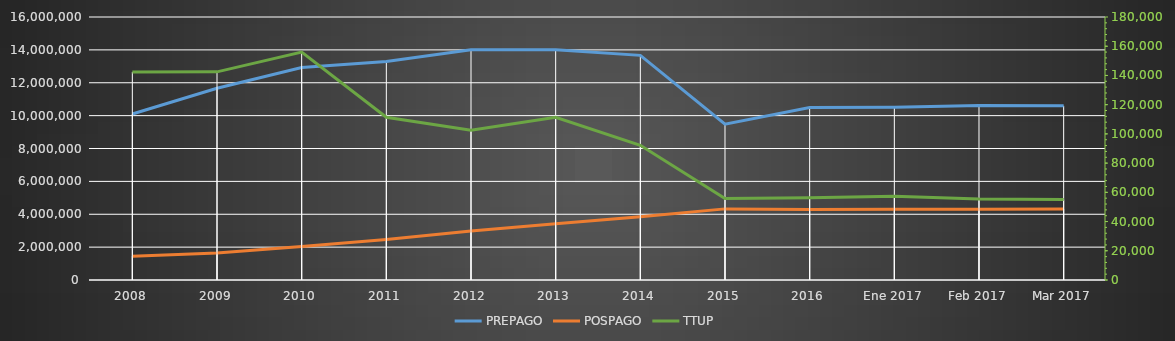
| Category | PREPAGO | POSPAGO |
|---|---|---|
| 2008 | 10097768 | 1452088 |
| 2009 | 11662294 | 1649838 |
| 2010 | 12929040 | 2033814 |
| 2011 | 13295834 | 2467378 |
| 2012 | 14008104 | 2976194 |
| 2013 | 14005126 | 3425277 |
| 2014 | 13666071 | 3846271 |
| 2015 | 9476240 | 4326937 |
| 2016 | 10498467 | 4293426 |
| Ene 2017 | 10505977.213 | 4309960.718 |
| Feb 2017 | 10611370 | 4302713 |
| Mar 2017 | 10593764 | 4322282 |